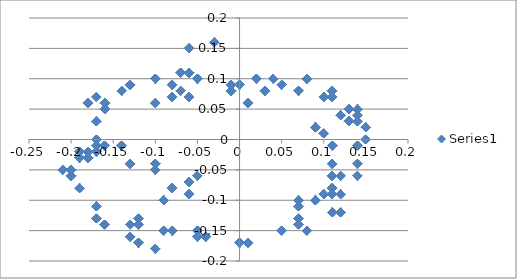
| Category | Series 0 |
|---|---|
| -0.2 | -0.06 |
| -0.2 | -0.06 |
| -0.2 | -0.06 |
| -0.2 | -0.06 |
| -0.2 | -0.06 |
| -0.2 | -0.06 |
| -0.2 | -0.06 |
| -0.2 | -0.06 |
| -0.2 | -0.06 |
| -0.2 | -0.06 |
| -0.2 | -0.06 |
| -0.2 | -0.06 |
| -0.2 | -0.05 |
| -0.2 | -0.05 |
| -0.2 | -0.05 |
| -0.2 | -0.05 |
| -0.2 | -0.05 |
| -0.2 | -0.05 |
| -0.2 | -0.05 |
| -0.2 | -0.05 |
| -0.2 | -0.05 |
| -0.2 | -0.05 |
| -0.2 | -0.05 |
| -0.2 | -0.05 |
| -0.2 | -0.05 |
| -0.2 | -0.05 |
| -0.2 | -0.05 |
| -0.2 | -0.05 |
| -0.2 | -0.05 |
| -0.2 | -0.05 |
| -0.2 | -0.05 |
| -0.2 | -0.05 |
| -0.2 | -0.05 |
| -0.2 | -0.05 |
| -0.2 | -0.05 |
| -0.2 | -0.05 |
| -0.2 | -0.05 |
| -0.2 | -0.05 |
| -0.2 | -0.05 |
| -0.2 | -0.05 |
| -0.2 | -0.05 |
| -0.2 | -0.05 |
| -0.2 | -0.05 |
| -0.2 | -0.05 |
| -0.2 | -0.05 |
| -0.2 | -0.05 |
| -0.2 | -0.05 |
| -0.2 | -0.05 |
| -0.2 | -0.05 |
| -0.2 | -0.05 |
| -0.2 | -0.05 |
| -0.2 | -0.05 |
| -0.2 | -0.05 |
| -0.2 | -0.05 |
| -0.21 | -0.05 |
| -0.21 | -0.05 |
| -0.21 | -0.05 |
| -0.21 | -0.05 |
| -0.21 | -0.05 |
| -0.21 | -0.05 |
| -0.2 | -0.06 |
| -0.2 | -0.06 |
| -0.2 | -0.06 |
| -0.2 | -0.06 |
| -0.2 | -0.06 |
| -0.2 | -0.06 |
| -0.19 | -0.08 |
| -0.19 | -0.08 |
| -0.19 | -0.08 |
| -0.19 | -0.08 |
| -0.19 | -0.08 |
| -0.19 | -0.08 |
| -0.19 | -0.08 |
| -0.19 | -0.08 |
| -0.19 | -0.08 |
| -0.19 | -0.08 |
| -0.19 | -0.08 |
| -0.19 | -0.08 |
| -0.17 | -0.11 |
| -0.17 | -0.11 |
| -0.17 | -0.11 |
| -0.17 | -0.11 |
| -0.17 | -0.11 |
| -0.17 | -0.11 |
| -0.17 | -0.13 |
| -0.17 | -0.13 |
| -0.17 | -0.13 |
| -0.17 | -0.13 |
| -0.17 | -0.13 |
| -0.17 | -0.13 |
| -0.16 | -0.14 |
| -0.16 | -0.14 |
| -0.16 | -0.14 |
| -0.16 | -0.14 |
| -0.16 | -0.14 |
| -0.16 | -0.14 |
| -0.16 | -0.14 |
| -0.16 | -0.14 |
| -0.16 | -0.14 |
| -0.16 | -0.14 |
| -0.16 | -0.14 |
| -0.16 | -0.14 |
| -0.13 | -0.14 |
| -0.13 | -0.14 |
| -0.13 | -0.14 |
| -0.13 | -0.14 |
| -0.13 | -0.14 |
| -0.13 | -0.14 |
| -0.12 | -0.13 |
| -0.12 | -0.13 |
| -0.12 | -0.13 |
| -0.12 | -0.13 |
| -0.12 | -0.13 |
| -0.12 | -0.13 |
| -0.12 | -0.14 |
| -0.12 | -0.14 |
| -0.12 | -0.14 |
| -0.12 | -0.14 |
| -0.12 | -0.14 |
| -0.12 | -0.14 |
| -0.12 | -0.14 |
| -0.12 | -0.14 |
| -0.12 | -0.14 |
| -0.12 | -0.14 |
| -0.12 | -0.14 |
| -0.12 | -0.14 |
| -0.13 | -0.16 |
| -0.13 | -0.16 |
| -0.13 | -0.16 |
| -0.13 | -0.16 |
| -0.13 | -0.16 |
| -0.13 | -0.16 |
| -0.12 | -0.17 |
| -0.12 | -0.17 |
| -0.12 | -0.17 |
| -0.12 | -0.17 |
| -0.12 | -0.17 |
| -0.12 | -0.17 |
| -0.12 | -0.17 |
| -0.12 | -0.17 |
| -0.12 | -0.17 |
| -0.12 | -0.17 |
| -0.12 | -0.17 |
| -0.12 | -0.17 |
| -0.1 | -0.18 |
| -0.1 | -0.18 |
| -0.1 | -0.18 |
| -0.1 | -0.18 |
| -0.1 | -0.18 |
| -0.1 | -0.18 |
| -0.09 | -0.15 |
| -0.09 | -0.15 |
| -0.09 | -0.15 |
| -0.09 | -0.15 |
| -0.09 | -0.15 |
| -0.09 | -0.15 |
| -0.08 | -0.15 |
| -0.08 | -0.15 |
| -0.08 | -0.15 |
| -0.08 | -0.15 |
| -0.08 | -0.15 |
| -0.08 | -0.15 |
| -0.08 | -0.15 |
| -0.08 | -0.15 |
| -0.08 | -0.15 |
| -0.08 | -0.15 |
| -0.08 | -0.15 |
| -0.08 | -0.15 |
| -0.05 | -0.15 |
| -0.05 | -0.15 |
| -0.05 | -0.15 |
| -0.05 | -0.15 |
| -0.05 | -0.15 |
| -0.05 | -0.15 |
| -0.05 | -0.16 |
| -0.05 | -0.16 |
| -0.05 | -0.16 |
| -0.05 | -0.16 |
| -0.05 | -0.16 |
| -0.05 | -0.16 |
| 0.0 | -0.17 |
| 0.0 | -0.17 |
| 0.0 | -0.17 |
| 0.0 | -0.17 |
| 0.0 | -0.17 |
| 0.0 | -0.17 |
| 0.0 | -0.17 |
| 0.0 | -0.17 |
| 0.0 | -0.17 |
| 0.0 | -0.17 |
| 0.0 | -0.17 |
| 0.0 | -0.17 |
| 0.07 | -0.14 |
| 0.07 | -0.14 |
| 0.07 | -0.14 |
| 0.07 | -0.14 |
| 0.07 | -0.14 |
| 0.07 | -0.14 |
| 0.11 | -0.09 |
| 0.11 | -0.09 |
| 0.11 | -0.09 |
| 0.11 | -0.09 |
| 0.11 | -0.09 |
| 0.11 | -0.09 |
| 0.11 | -0.09 |
| 0.11 | -0.09 |
| 0.11 | -0.09 |
| 0.11 | -0.09 |
| 0.11 | -0.09 |
| 0.11 | -0.09 |
| 0.12 | -0.12 |
| 0.12 | -0.12 |
| 0.12 | -0.12 |
| 0.12 | -0.12 |
| 0.12 | -0.12 |
| 0.12 | -0.12 |
| 0.08 | -0.15 |
| 0.08 | -0.15 |
| 0.08 | -0.15 |
| 0.08 | -0.15 |
| 0.08 | -0.15 |
| 0.08 | -0.15 |
| 0.07 | -0.13 |
| 0.07 | -0.13 |
| 0.07 | -0.13 |
| 0.07 | -0.13 |
| 0.07 | -0.13 |
| 0.07 | -0.13 |
| 0.07 | -0.13 |
| 0.07 | -0.13 |
| 0.07 | -0.13 |
| 0.07 | -0.13 |
| 0.07 | -0.13 |
| 0.07 | -0.13 |
| 0.07 | -0.1 |
| 0.07 | -0.1 |
| 0.07 | -0.1 |
| 0.07 | -0.1 |
| 0.07 | -0.1 |
| 0.07 | -0.1 |
| 0.07 | -0.11 |
| 0.07 | -0.11 |
| 0.07 | -0.11 |
| 0.07 | -0.11 |
| 0.07 | -0.11 |
| 0.07 | -0.11 |
| 0.11 | -0.12 |
| 0.11 | -0.12 |
| 0.11 | -0.12 |
| 0.11 | -0.12 |
| 0.11 | -0.12 |
| 0.11 | -0.12 |
| 0.11 | -0.12 |
| 0.11 | -0.12 |
| 0.11 | -0.12 |
| 0.11 | -0.12 |
| 0.11 | -0.12 |
| 0.11 | -0.12 |
| 0.11 | -0.08 |
| 0.11 | -0.08 |
| 0.11 | -0.08 |
| 0.11 | -0.08 |
| 0.11 | -0.08 |
| 0.11 | -0.08 |
| 0.11 | -0.04 |
| 0.11 | -0.04 |
| 0.11 | -0.04 |
| 0.11 | -0.04 |
| 0.11 | -0.04 |
| 0.11 | -0.04 |
| 0.11 | -0.01 |
| 0.11 | -0.01 |
| 0.11 | -0.01 |
| 0.11 | -0.01 |
| 0.11 | -0.01 |
| 0.11 | -0.01 |
| 0.11 | -0.01 |
| 0.11 | -0.01 |
| 0.11 | -0.01 |
| 0.11 | -0.01 |
| 0.11 | -0.01 |
| 0.11 | -0.01 |
| 0.1 | 0.01 |
| 0.1 | 0.01 |
| 0.1 | 0.01 |
| 0.1 | 0.01 |
| 0.1 | 0.01 |
| 0.1 | 0.01 |
| 0.09 | 0.02 |
| 0.09 | 0.02 |
| 0.09 | 0.02 |
| 0.09 | 0.02 |
| 0.09 | 0.02 |
| 0.09 | 0.02 |
| 0.09 | 0.02 |
| 0.09 | 0.02 |
| 0.09 | 0.02 |
| 0.09 | 0.02 |
| 0.09 | 0.02 |
| 0.09 | 0.02 |
| 0.09 | 0.02 |
| 0.09 | 0.02 |
| 0.09 | 0.02 |
| 0.09 | 0.02 |
| 0.09 | 0.02 |
| 0.09 | 0.02 |
| 0.12 | -0.09 |
| 0.12 | -0.09 |
| 0.12 | -0.09 |
| 0.12 | -0.09 |
| 0.12 | -0.09 |
| 0.12 | -0.09 |
| 0.14 | -0.06 |
| 0.14 | -0.06 |
| 0.14 | -0.06 |
| 0.14 | -0.06 |
| 0.14 | -0.06 |
| 0.14 | -0.06 |
| 0.14 | -0.06 |
| 0.14 | -0.06 |
| 0.14 | -0.06 |
| 0.14 | -0.06 |
| 0.14 | -0.06 |
| 0.14 | -0.06 |
| 0.14 | -0.01 |
| 0.14 | -0.01 |
| 0.14 | -0.01 |
| 0.14 | -0.01 |
| 0.14 | -0.01 |
| 0.14 | -0.01 |
| 0.14 | 0.03 |
| 0.14 | 0.03 |
| 0.14 | 0.03 |
| 0.14 | 0.03 |
| 0.14 | 0.03 |
| 0.14 | 0.03 |
| 0.13 | 0.03 |
| 0.13 | 0.03 |
| 0.13 | 0.03 |
| 0.13 | 0.03 |
| 0.13 | 0.03 |
| 0.13 | 0.03 |
| 0.13 | 0.03 |
| 0.13 | 0.03 |
| 0.13 | 0.03 |
| 0.13 | 0.03 |
| 0.13 | 0.03 |
| 0.13 | 0.03 |
| 0.12 | 0.04 |
| 0.12 | 0.04 |
| 0.12 | 0.04 |
| 0.12 | 0.04 |
| 0.12 | 0.04 |
| 0.12 | 0.04 |
| 0.11 | 0.08 |
| 0.11 | 0.08 |
| 0.11 | 0.08 |
| 0.11 | 0.08 |
| 0.11 | 0.08 |
| 0.11 | 0.08 |
| 0.11 | 0.08 |
| 0.11 | 0.08 |
| 0.11 | 0.08 |
| 0.11 | 0.08 |
| 0.11 | 0.08 |
| 0.11 | 0.08 |
| 0.13 | 0.05 |
| 0.13 | 0.05 |
| 0.13 | 0.05 |
| 0.13 | 0.05 |
| 0.13 | 0.05 |
| 0.13 | 0.05 |
| 0.11 | 0.07 |
| 0.11 | 0.07 |
| 0.11 | 0.07 |
| 0.11 | 0.07 |
| 0.11 | 0.07 |
| 0.11 | 0.07 |
| 0.07 | 0.08 |
| 0.07 | 0.08 |
| 0.07 | 0.08 |
| 0.07 | 0.08 |
| 0.07 | 0.08 |
| 0.07 | 0.08 |
| 0.07 | 0.08 |
| 0.07 | 0.08 |
| 0.07 | 0.08 |
| 0.07 | 0.08 |
| 0.07 | 0.08 |
| 0.07 | 0.08 |
| 0.05 | 0.09 |
| 0.05 | 0.09 |
| 0.05 | 0.09 |
| 0.05 | 0.09 |
| 0.05 | 0.09 |
| 0.05 | 0.09 |
| 0.04 | 0.1 |
| 0.04 | 0.1 |
| 0.04 | 0.1 |
| 0.04 | 0.1 |
| 0.04 | 0.1 |
| 0.04 | 0.1 |
| 0.0 | 0.09 |
| 0.0 | 0.09 |
| 0.0 | 0.09 |
| 0.0 | 0.09 |
| 0.0 | 0.09 |
| 0.0 | 0.09 |
| 0.0 | 0.09 |
| 0.0 | 0.09 |
| 0.0 | 0.09 |
| 0.0 | 0.09 |
| 0.0 | 0.09 |
| 0.0 | 0.09 |
| -0.01 | 0.09 |
| -0.01 | 0.09 |
| -0.01 | 0.09 |
| -0.01 | 0.09 |
| -0.01 | 0.09 |
| -0.01 | 0.09 |
| -0.01 | 0.08 |
| -0.01 | 0.08 |
| -0.01 | 0.08 |
| -0.01 | 0.08 |
| -0.01 | 0.08 |
| -0.01 | 0.08 |
| -0.01 | 0.08 |
| -0.01 | 0.08 |
| -0.01 | 0.08 |
| -0.01 | 0.08 |
| -0.01 | 0.08 |
| -0.01 | 0.08 |
| -0.07 | 0.08 |
| -0.07 | 0.08 |
| -0.07 | 0.08 |
| -0.07 | 0.08 |
| -0.07 | 0.08 |
| -0.07 | 0.08 |
| -0.08 | 0.07 |
| -0.08 | 0.07 |
| -0.08 | 0.07 |
| -0.08 | 0.07 |
| -0.08 | 0.07 |
| -0.08 | 0.07 |
| -0.06 | 0.11 |
| -0.06 | 0.11 |
| -0.06 | 0.11 |
| -0.06 | 0.11 |
| -0.06 | 0.11 |
| -0.06 | 0.11 |
| -0.06 | 0.11 |
| -0.06 | 0.11 |
| -0.06 | 0.11 |
| -0.06 | 0.11 |
| -0.06 | 0.11 |
| -0.06 | 0.11 |
| -0.07 | 0.11 |
| -0.07 | 0.11 |
| -0.07 | 0.11 |
| -0.07 | 0.11 |
| -0.07 | 0.11 |
| -0.07 | 0.11 |
| -0.03 | 0.16 |
| -0.03 | 0.16 |
| -0.03 | 0.16 |
| -0.03 | 0.16 |
| -0.03 | 0.16 |
| -0.03 | 0.16 |
| -0.06 | 0.15 |
| -0.06 | 0.15 |
| -0.06 | 0.15 |
| -0.06 | 0.15 |
| -0.06 | 0.15 |
| -0.06 | 0.15 |
| -0.06 | 0.15 |
| -0.06 | 0.15 |
| -0.06 | 0.15 |
| -0.06 | 0.15 |
| -0.06 | 0.15 |
| -0.06 | 0.15 |
| -0.08 | 0.09 |
| -0.08 | 0.09 |
| -0.08 | 0.09 |
| -0.08 | 0.09 |
| -0.08 | 0.09 |
| -0.08 | 0.09 |
| -0.1 | 0.06 |
| -0.1 | 0.06 |
| -0.1 | 0.06 |
| -0.1 | 0.06 |
| -0.1 | 0.06 |
| -0.1 | 0.06 |
| -0.14 | -0.01 |
| -0.14 | -0.01 |
| -0.14 | -0.01 |
| -0.14 | -0.01 |
| -0.14 | -0.01 |
| -0.14 | -0.01 |
| -0.14 | -0.01 |
| -0.14 | -0.01 |
| -0.14 | -0.01 |
| -0.14 | -0.01 |
| -0.14 | -0.01 |
| -0.14 | -0.01 |
| -0.13 | -0.04 |
| -0.13 | -0.04 |
| -0.13 | -0.04 |
| -0.13 | -0.04 |
| -0.13 | -0.04 |
| -0.13 | -0.04 |
| -0.1 | -0.04 |
| -0.1 | -0.04 |
| -0.1 | -0.04 |
| -0.1 | -0.04 |
| -0.1 | -0.04 |
| -0.1 | -0.04 |
| -0.1 | -0.04 |
| -0.1 | -0.04 |
| -0.1 | -0.04 |
| -0.1 | -0.04 |
| -0.1 | -0.04 |
| -0.1 | -0.04 |
| -0.1 | -0.05 |
| -0.1 | -0.05 |
| -0.1 | -0.05 |
| -0.1 | -0.05 |
| -0.1 | -0.05 |
| -0.1 | -0.05 |
| -0.08 | -0.08 |
| -0.08 | -0.08 |
| -0.08 | -0.08 |
| -0.08 | -0.08 |
| -0.08 | -0.08 |
| -0.08 | -0.08 |
| -0.09 | -0.1 |
| -0.09 | -0.1 |
| -0.09 | -0.1 |
| -0.09 | -0.1 |
| -0.09 | -0.1 |
| -0.09 | -0.1 |
| -0.09 | -0.1 |
| -0.09 | -0.1 |
| -0.09 | -0.1 |
| -0.09 | -0.1 |
| -0.09 | -0.1 |
| -0.09 | -0.1 |
| -0.08 | -0.08 |
| -0.08 | -0.08 |
| -0.08 | -0.08 |
| -0.08 | -0.08 |
| -0.08 | -0.08 |
| -0.08 | -0.08 |
| -0.06 | -0.07 |
| -0.06 | -0.07 |
| -0.06 | -0.07 |
| -0.06 | -0.07 |
| -0.06 | -0.07 |
| -0.06 | -0.07 |
| -0.05 | -0.06 |
| -0.05 | -0.06 |
| -0.05 | -0.06 |
| -0.05 | -0.06 |
| -0.05 | -0.06 |
| -0.05 | -0.06 |
| -0.05 | -0.06 |
| -0.05 | -0.06 |
| -0.05 | -0.06 |
| -0.05 | -0.06 |
| -0.05 | -0.06 |
| -0.05 | -0.06 |
| -0.06 | -0.09 |
| -0.06 | -0.09 |
| -0.06 | -0.09 |
| -0.06 | -0.09 |
| -0.06 | -0.09 |
| -0.06 | -0.09 |
| -0.04 | -0.16 |
| -0.04 | -0.16 |
| -0.04 | -0.16 |
| -0.04 | -0.16 |
| -0.04 | -0.16 |
| -0.04 | -0.16 |
| -0.04 | -0.16 |
| -0.04 | -0.16 |
| -0.04 | -0.16 |
| -0.04 | -0.16 |
| -0.04 | -0.16 |
| -0.04 | -0.16 |
| 0.01 | -0.17 |
| 0.01 | -0.17 |
| 0.01 | -0.17 |
| 0.01 | -0.17 |
| 0.01 | -0.17 |
| 0.01 | -0.17 |
| 0.05 | -0.15 |
| 0.05 | -0.15 |
| 0.05 | -0.15 |
| 0.05 | -0.15 |
| 0.05 | -0.15 |
| 0.05 | -0.15 |
| 0.09 | -0.1 |
| 0.09 | -0.1 |
| 0.09 | -0.1 |
| 0.09 | -0.1 |
| 0.09 | -0.1 |
| 0.09 | -0.1 |
| 0.09 | -0.1 |
| 0.09 | -0.1 |
| 0.09 | -0.1 |
| 0.09 | -0.1 |
| 0.09 | -0.1 |
| 0.09 | -0.1 |
| 0.1 | -0.09 |
| 0.1 | -0.09 |
| 0.1 | -0.09 |
| 0.1 | -0.09 |
| 0.1 | -0.09 |
| 0.1 | -0.09 |
| 0.11 | -0.08 |
| 0.11 | -0.08 |
| 0.11 | -0.08 |
| 0.11 | -0.08 |
| 0.11 | -0.08 |
| 0.11 | -0.08 |
| 0.11 | -0.06 |
| 0.11 | -0.06 |
| 0.11 | -0.06 |
| 0.11 | -0.06 |
| 0.11 | -0.06 |
| 0.11 | -0.06 |
| 0.11 | -0.06 |
| 0.11 | -0.06 |
| 0.11 | -0.06 |
| 0.11 | -0.06 |
| 0.11 | -0.06 |
| 0.11 | -0.06 |
| 0.12 | -0.06 |
| 0.12 | -0.06 |
| 0.12 | -0.06 |
| 0.12 | -0.06 |
| 0.12 | -0.06 |
| 0.12 | -0.06 |
| 0.14 | -0.04 |
| 0.14 | -0.04 |
| 0.14 | -0.04 |
| 0.14 | -0.04 |
| 0.14 | -0.04 |
| 0.14 | -0.04 |
| 0.15 | 0 |
| 0.15 | 0 |
| 0.15 | 0 |
| 0.15 | 0 |
| 0.15 | 0 |
| 0.15 | 0 |
| 0.15 | 0 |
| 0.15 | 0 |
| 0.15 | 0 |
| 0.15 | 0 |
| 0.15 | 0 |
| 0.15 | 0 |
| 0.15 | 0.02 |
| 0.15 | 0.02 |
| 0.15 | 0.02 |
| 0.15 | 0.02 |
| 0.15 | 0.02 |
| 0.15 | 0.02 |
| 0.14 | 0.05 |
| 0.14 | 0.05 |
| 0.14 | 0.05 |
| 0.14 | 0.05 |
| 0.14 | 0.05 |
| 0.14 | 0.05 |
| 0.14 | 0.05 |
| 0.14 | 0.05 |
| 0.14 | 0.05 |
| 0.14 | 0.05 |
| 0.14 | 0.05 |
| 0.14 | 0.05 |
| 0.14 | 0.04 |
| 0.14 | 0.04 |
| 0.14 | 0.04 |
| 0.14 | 0.04 |
| 0.14 | 0.04 |
| 0.14 | 0.04 |
| 0.1 | 0.07 |
| 0.1 | 0.07 |
| 0.1 | 0.07 |
| 0.1 | 0.07 |
| 0.1 | 0.07 |
| 0.1 | 0.07 |
| 0.08 | 0.1 |
| 0.08 | 0.1 |
| 0.08 | 0.1 |
| 0.08 | 0.1 |
| 0.08 | 0.1 |
| 0.08 | 0.1 |
| 0.08 | 0.1 |
| 0.08 | 0.1 |
| 0.08 | 0.1 |
| 0.08 | 0.1 |
| 0.08 | 0.1 |
| 0.08 | 0.1 |
| 0.02 | 0.1 |
| 0.02 | 0.1 |
| 0.02 | 0.1 |
| 0.02 | 0.1 |
| 0.02 | 0.1 |
| 0.02 | 0.1 |
| 0.01 | 0.06 |
| 0.01 | 0.06 |
| 0.01 | 0.06 |
| 0.01 | 0.06 |
| 0.01 | 0.06 |
| 0.01 | 0.06 |
| 0.03 | 0.08 |
| 0.03 | 0.08 |
| 0.03 | 0.08 |
| 0.03 | 0.08 |
| 0.03 | 0.08 |
| 0.03 | 0.08 |
| 0.03 | 0.08 |
| 0.03 | 0.08 |
| 0.03 | 0.08 |
| 0.03 | 0.08 |
| 0.03 | 0.08 |
| 0.03 | 0.08 |
| -0.01 | 0.09 |
| -0.01 | 0.09 |
| -0.01 | 0.09 |
| -0.01 | 0.09 |
| -0.01 | 0.09 |
| -0.01 | 0.09 |
| -0.05 | 0.1 |
| -0.05 | 0.1 |
| -0.05 | 0.1 |
| -0.05 | 0.1 |
| -0.05 | 0.1 |
| -0.05 | 0.1 |
| -0.05 | 0.1 |
| -0.05 | 0.1 |
| -0.05 | 0.1 |
| -0.05 | 0.1 |
| -0.05 | 0.1 |
| -0.05 | 0.1 |
| -0.06 | 0.11 |
| -0.06 | 0.11 |
| -0.06 | 0.11 |
| -0.06 | 0.11 |
| -0.06 | 0.11 |
| -0.06 | 0.11 |
| -0.06 | 0.07 |
| -0.06 | 0.07 |
| -0.06 | 0.07 |
| -0.06 | 0.07 |
| -0.06 | 0.07 |
| -0.06 | 0.07 |
| -0.1 | 0.1 |
| -0.1 | 0.1 |
| -0.1 | 0.1 |
| -0.1 | 0.1 |
| -0.1 | 0.1 |
| -0.1 | 0.1 |
| -0.1 | 0.1 |
| -0.1 | 0.1 |
| -0.1 | 0.1 |
| -0.1 | 0.1 |
| -0.1 | 0.1 |
| -0.1 | 0.1 |
| -0.13 | 0.09 |
| -0.13 | 0.09 |
| -0.13 | 0.09 |
| -0.13 | 0.09 |
| -0.13 | 0.09 |
| -0.13 | 0.09 |
| -0.14 | 0.08 |
| -0.14 | 0.08 |
| -0.14 | 0.08 |
| -0.14 | 0.08 |
| -0.14 | 0.08 |
| -0.14 | 0.08 |
| -0.16 | 0.06 |
| -0.16 | 0.06 |
| -0.16 | 0.06 |
| -0.16 | 0.06 |
| -0.16 | 0.06 |
| -0.16 | 0.06 |
| -0.16 | 0.06 |
| -0.16 | 0.06 |
| -0.16 | 0.06 |
| -0.16 | 0.06 |
| -0.16 | 0.06 |
| -0.16 | 0.06 |
| -0.18 | 0.06 |
| -0.18 | 0.06 |
| -0.18 | 0.06 |
| -0.18 | 0.06 |
| -0.18 | 0.06 |
| -0.18 | 0.06 |
| -0.17 | 0.07 |
| -0.17 | 0.07 |
| -0.17 | 0.07 |
| -0.17 | 0.07 |
| -0.17 | 0.07 |
| -0.17 | 0.07 |
| -0.16 | 0.05 |
| -0.16 | 0.05 |
| -0.16 | 0.05 |
| -0.16 | 0.05 |
| -0.16 | 0.05 |
| -0.16 | 0.05 |
| -0.16 | 0.05 |
| -0.16 | 0.05 |
| -0.16 | 0.05 |
| -0.16 | 0.05 |
| -0.16 | 0.05 |
| -0.16 | 0.05 |
| -0.17 | 0.03 |
| -0.17 | 0.03 |
| -0.17 | 0.03 |
| -0.17 | 0.03 |
| -0.17 | 0.03 |
| -0.17 | 0.03 |
| -0.17 | 0 |
| -0.17 | 0 |
| -0.17 | 0 |
| -0.17 | 0 |
| -0.17 | 0 |
| -0.17 | 0 |
| -0.17 | 0 |
| -0.17 | 0 |
| -0.17 | 0 |
| -0.17 | 0 |
| -0.17 | 0 |
| -0.17 | 0 |
| -0.17 | -0.01 |
| -0.17 | -0.01 |
| -0.17 | -0.01 |
| -0.17 | -0.01 |
| -0.17 | -0.01 |
| -0.17 | -0.01 |
| -0.16 | -0.01 |
| -0.16 | -0.01 |
| -0.16 | -0.01 |
| -0.16 | -0.01 |
| -0.16 | -0.01 |
| -0.16 | -0.01 |
| -0.16 | -0.01 |
| -0.16 | -0.01 |
| -0.16 | -0.01 |
| -0.16 | -0.01 |
| -0.16 | -0.01 |
| -0.16 | -0.01 |
| -0.16 | -0.01 |
| -0.16 | -0.01 |
| -0.16 | -0.01 |
| -0.16 | -0.01 |
| -0.16 | -0.01 |
| -0.16 | -0.01 |
| -0.17 | -0.02 |
| -0.17 | -0.02 |
| -0.17 | -0.02 |
| -0.17 | -0.02 |
| -0.17 | -0.02 |
| -0.17 | -0.02 |
| -0.18 | -0.02 |
| -0.18 | -0.02 |
| -0.18 | -0.02 |
| -0.18 | -0.02 |
| -0.18 | -0.02 |
| -0.18 | -0.02 |
| -0.18 | -0.02 |
| -0.18 | -0.02 |
| -0.18 | -0.02 |
| -0.18 | -0.02 |
| -0.18 | -0.02 |
| -0.18 | -0.02 |
| -0.18 | -0.02 |
| -0.18 | -0.02 |
| -0.18 | -0.02 |
| -0.18 | -0.02 |
| -0.18 | -0.02 |
| -0.18 | -0.02 |
| -0.19 | -0.02 |
| -0.19 | -0.02 |
| -0.19 | -0.02 |
| -0.19 | -0.02 |
| -0.19 | -0.02 |
| -0.19 | -0.02 |
| -0.19 | -0.03 |
| -0.19 | -0.03 |
| -0.19 | -0.03 |
| -0.19 | -0.03 |
| -0.19 | -0.03 |
| -0.19 | -0.03 |
| -0.19 | -0.03 |
| -0.19 | -0.03 |
| -0.19 | -0.03 |
| -0.19 | -0.03 |
| -0.19 | -0.03 |
| -0.19 | -0.03 |
| -0.18 | -0.03 |
| -0.18 | -0.03 |
| -0.18 | -0.03 |
| -0.18 | -0.03 |
| -0.18 | -0.03 |
| -0.18 | -0.03 |
| -0.18 | -0.03 |
| -0.18 | -0.03 |
| -0.18 | -0.03 |
| -0.18 | -0.03 |
| -0.18 | -0.03 |
| -0.18 | -0.03 |
| -0.18 | -0.02 |
| -0.18 | -0.02 |
| -0.18 | -0.02 |
| -0.18 | -0.02 |
| -0.18 | -0.02 |
| -0.18 | -0.02 |
| -0.18 | -0.02 |
| -0.18 | -0.02 |
| -0.18 | -0.02 |
| -0.18 | -0.02 |
| -0.18 | -0.02 |
| -0.18 | -0.02 |
| -0.18 | -0.02 |
| -0.18 | -0.02 |
| -0.18 | -0.02 |
| -0.18 | -0.02 |
| -0.18 | -0.02 |
| -0.18 | -0.02 |
| -0.18 | -0.03 |
| -0.18 | -0.03 |
| -0.18 | -0.03 |
| -0.18 | -0.03 |
| -0.18 | -0.03 |
| -0.18 | -0.03 |
| -0.18 | -0.02 |
| -0.18 | -0.02 |
| -0.18 | -0.02 |
| -0.18 | -0.02 |
| -0.18 | -0.02 |
| -0.18 | -0.02 |
| -0.18 | -0.02 |
| -0.18 | -0.02 |
| -0.18 | -0.02 |
| -0.18 | -0.02 |
| -0.18 | -0.02 |
| -0.18 | -0.02 |
| -0.18 | -0.03 |
| -0.18 | -0.03 |
| -0.18 | -0.03 |
| -0.18 | -0.03 |
| -0.18 | -0.03 |
| -0.18 | -0.03 |
| -0.18 | -0.03 |
| -0.18 | -0.03 |
| -0.18 | -0.03 |
| -0.18 | -0.03 |
| -0.18 | -0.03 |
| -0.18 | -0.03 |
| -0.18 | -0.03 |
| -0.18 | -0.03 |